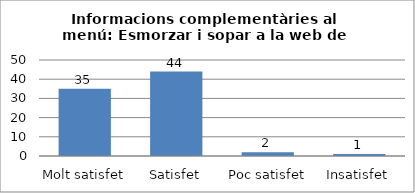
| Category | Series 0 |
|---|---|
| Molt satisfet | 35 |
| Satisfet | 44 |
| Poc satisfet | 2 |
| Insatisfet | 1 |